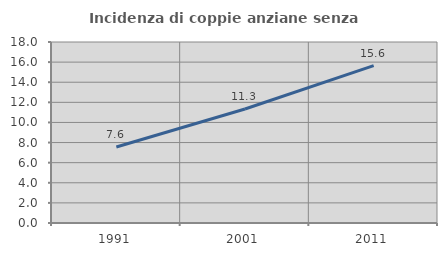
| Category | Incidenza di coppie anziane senza figli  |
|---|---|
| 1991.0 | 7.555 |
| 2001.0 | 11.339 |
| 2011.0 | 15.644 |